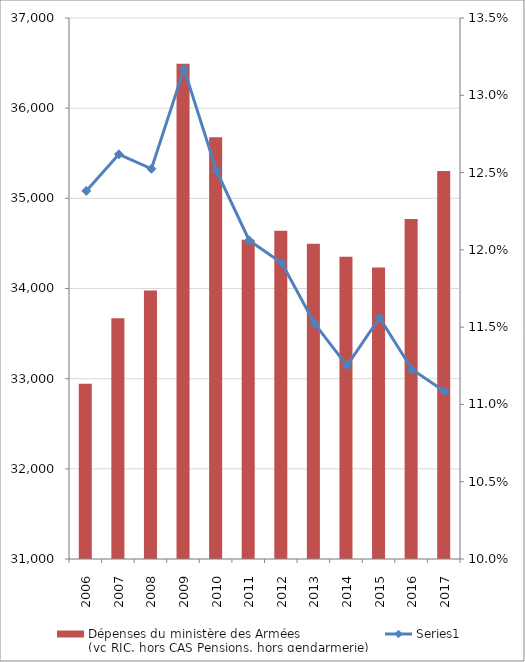
| Category | Dépenses du ministère des Armées
(yc RIC, hors CAS Pensions, hors gendarmerie) |
|---|---|
| 2006.0 | 32944.534 |
| 2007.0 | 33670.863 |
| 2008.0 | 33977.072 |
| 2009.0 | 36493.324 |
| 2010.0 | 35677.958 |
| 2011.0 | 34541.386 |
| 2012.0 | 34639.677 |
| 2013.0 | 34496.377 |
| 2014.0 | 34350.997 |
| 2015.0 | 34232.969 |
| 2016.0 | 34769.946 |
| 2017.0 | 35303.578 |